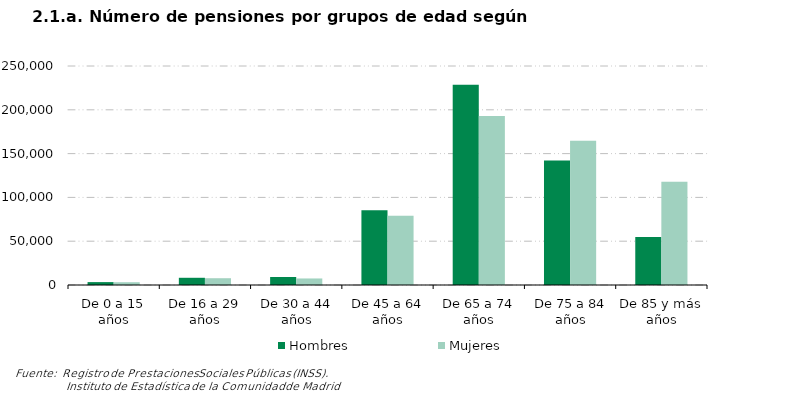
| Category | Hombres | Mujeres |
|---|---|---|
| De 0 a 15 años | 3305 | 3174 |
| De 16 a 29 años | 8239 | 7735 |
| De 30 a 44 años | 9129 | 7459 |
| De 45 a 64 años | 85239 | 79063 |
| De 65 a 74 años | 228723 | 192803 |
| De 75 a 84 años | 142110 | 164752 |
| De 85 y más años | 54750 | 117841 |